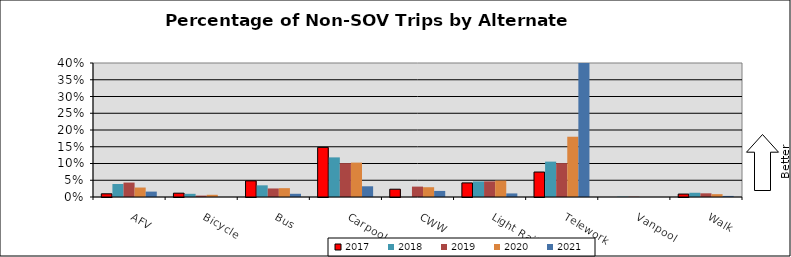
| Category | 2017 | 2018 | 2019 | 2020 | 2021 |
|---|---|---|---|---|---|
| AFV | 0.01 | 0.039 | 0.043 | 0.028 | 0.016 |
| Bicycle | 0.011 | 0.01 | 0.004 | 0.007 | 0 |
| Bus | 0.048 | 0.035 | 0.026 | 0.026 | 0.01 |
| Carpool | 0.148 | 0.118 | 0.101 | 0.103 | 0.032 |
| CWW | 0.023 | 0 | 0.031 | 0.029 | 0.018 |
| Light Rail | 0.042 | 0.046 | 0.047 | 0.049 | 0.011 |
| Telework | 0.075 | 0.106 | 0.101 | 0.18 | 0.761 |
| Vanpool | 0 | 0.001 | 0.001 | 0 | 0 |
| Walk | 0.009 | 0.013 | 0.011 | 0.008 | 0.003 |